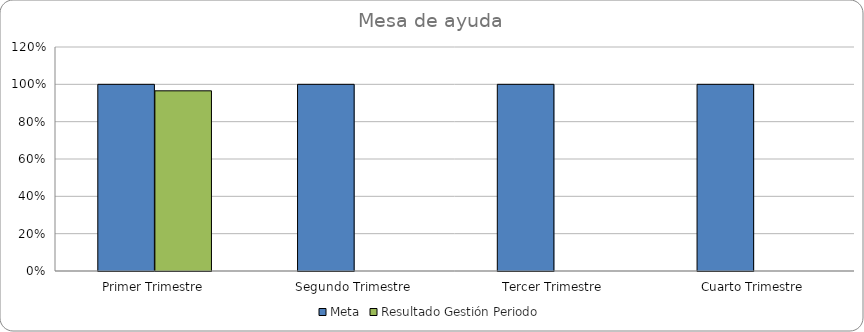
| Category | Meta | Resultado Gestión Periodo |
|---|---|---|
| Primer Trimestre | 1 | 0.965 |
| Segundo Trimestre | 1 | 0 |
| Tercer Trimestre | 1 | 0 |
| Cuarto Trimestre | 1 | 0 |